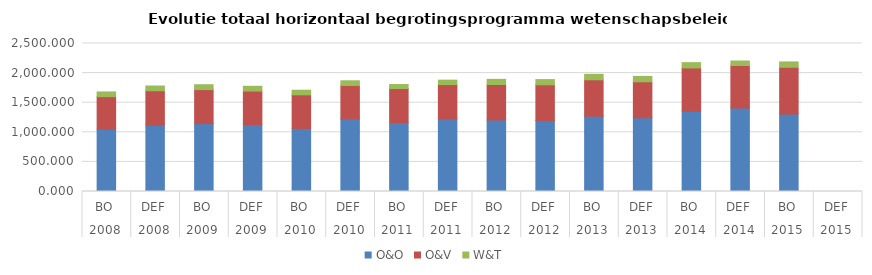
| Category | O&O | O&V | W&T |
|---|---|---|---|
| 0 | 1051.396 | 551.057 | 79.392 |
| 1 | 1121.429 | 580.39 | 80.169 |
| 2 | 1146.966 | 574.152 | 82.704 |
| 3 | 1130.072 | 566.593 | 80.26 |
| 4 | 1065.927 | 567.27 | 77.439 |
| 5 | 1224.024 | 567.392 | 78.753 |
| 6 | 1162.77 | 575.921 | 68.218 |
| 7 | 1227.577 | 578.81 | 74.272 |
| 8 | 1207.733 | 600.119 | 86.223 |
| 9 | 1200.963 | 601.509 | 87.744 |
| 10 | 1271.481 | 615.151 | 92.683 |
| 11 | 1244.821 | 608.605 | 90.626 |
| 12 | 1354.375 | 733.086 | 89.199 |
| 13 | 1409.96 | 718.85 | 75.627 |
| 14 | 1307.621 | 791.211 | 90.309 |
| 15 | 0 | 0 | 0 |